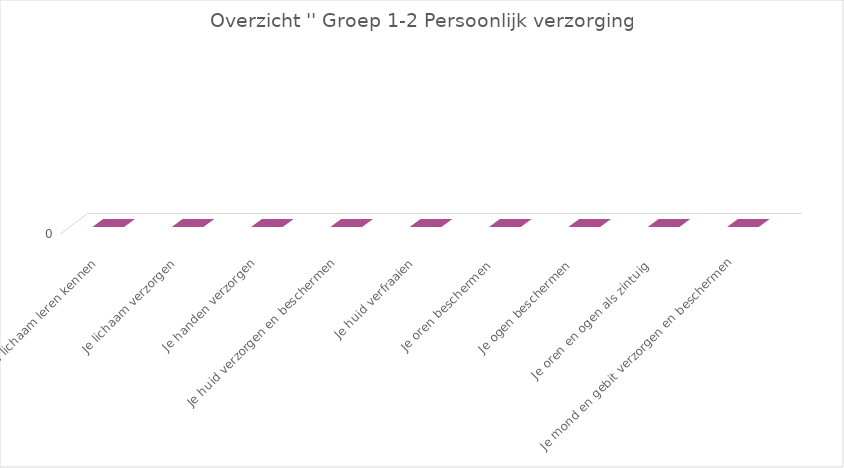
| Category | Series 2 |
|---|---|
| Je lichaam leren kennen | 0 |
| Je lichaam verzorgen | 0 |
| Je handen verzorgen | 0 |
| Je huid verzorgen en beschermen | 0 |
| Je huid verfraaien | 0 |
| Je oren beschermen  | 0 |
| Je ogen beschermen  | 0 |
| Je oren en ogen als zintuig  | 0 |
| Je mond en gebit verzorgen en beschermen | 0 |